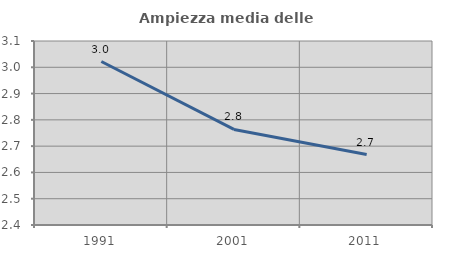
| Category | Ampiezza media delle famiglie |
|---|---|
| 1991.0 | 3.022 |
| 2001.0 | 2.764 |
| 2011.0 | 2.668 |